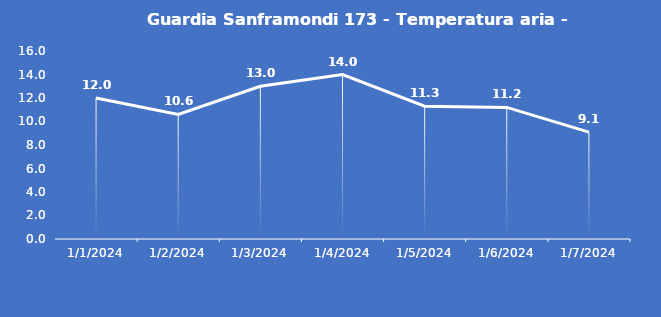
| Category | Guardia Sanframondi 173 - Temperatura aria - Grezzo (°C) |
|---|---|
| 1/1/24 | 12 |
| 1/2/24 | 10.6 |
| 1/3/24 | 13 |
| 1/4/24 | 14 |
| 1/5/24 | 11.3 |
| 1/6/24 | 11.2 |
| 1/7/24 | 9.1 |